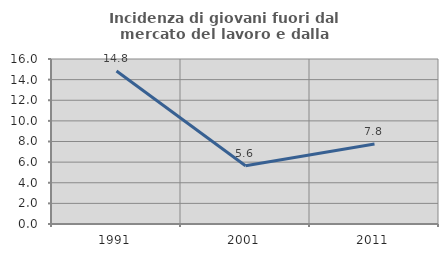
| Category | Incidenza di giovani fuori dal mercato del lavoro e dalla formazione  |
|---|---|
| 1991.0 | 14.833 |
| 2001.0 | 5.65 |
| 2011.0 | 7.752 |